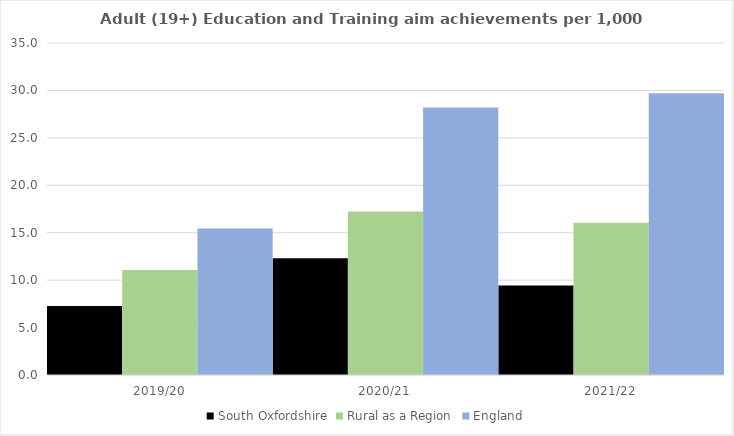
| Category | South Oxfordshire | Rural as a Region | England |
|---|---|---|---|
| 2019/20 | 7.269 | 11.081 | 15.446 |
| 2020/21 | 12.303 | 17.224 | 28.211 |
| 2021/22 | 9.431 | 16.063 | 29.711 |